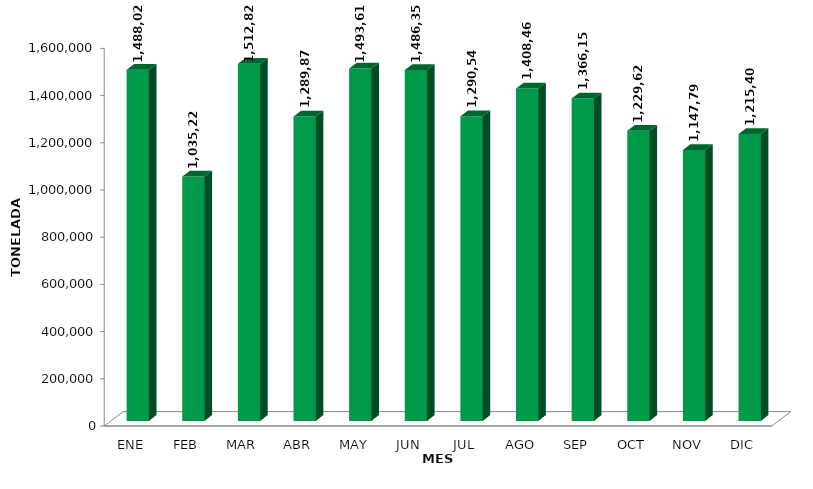
| Category | Series 0 |
|---|---|
| ENE | 1488029.2 |
| FEB | 1035225.972 |
| MAR | 1512822.132 |
| ABR | 1289876.039 |
| MAY | 1493610.77 |
| JUN | 1486358.794 |
| JUL | 1290545.701 |
| AGO | 1408464.822 |
| SEP | 1366152.077 |
| OCT | 1229620.293 |
| NOV | 1147796.965 |
| DIC | 1215400.232 |